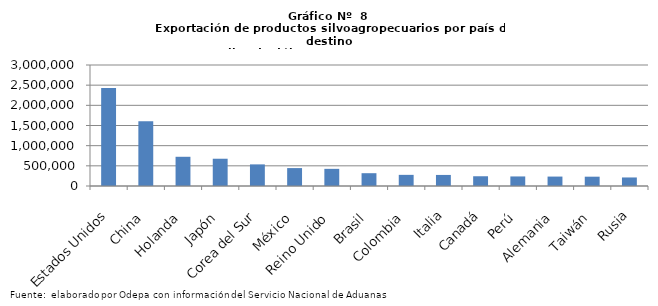
| Category | Series 0 |
|---|---|
| Estados Unidos | 2430896.611 |
| China | 1603388.965 |
| Holanda | 724392.635 |
| Japón | 676124.9 |
| Corea del Sur | 535989.89 |
| México | 444202.895 |
| Reino Unido | 425368.028 |
| Brasil | 317471.266 |
| Colombia | 276303.338 |
| Italia | 274272.565 |
| Canadá | 241621.337 |
| Perú | 236977.513 |
| Alemania | 233678.231 |
| Taiwán | 231092.525 |
| Rusia | 211735.595 |